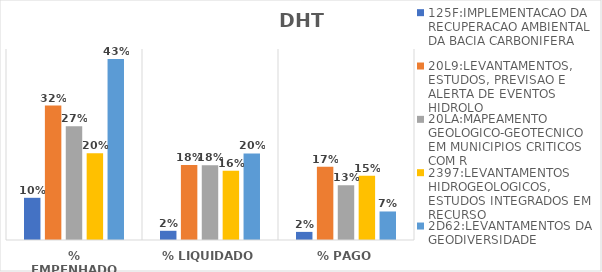
| Category | 125F:IMPLEMENTACAO DA RECUPERACAO AMBIENTAL DA BACIA CARBONIFERA | 20L9:LEVANTAMENTOS, ESTUDOS, PREVISAO E ALERTA DE EVENTOS HIDROLO | 20LA:MAPEAMENTO GEOLOGICO-GEOTECNICO EM MUNICIPIOS CRITICOS COM R | 2397:LEVANTAMENTOS HIDROGEOLOGICOS, ESTUDOS INTEGRADOS EM RECURSO | 2D62:LEVANTAMENTOS DA GEODIVERSIDADE |
|---|---|---|---|---|---|
| % EMPENHADO | 0.099 | 0.317 | 0.268 | 0.205 | 0.427 |
| % LIQUIDADO | 0.022 | 0.177 | 0.176 | 0.163 | 0.204 |
| % PAGO | 0.019 | 0.173 | 0.129 | 0.152 | 0.067 |